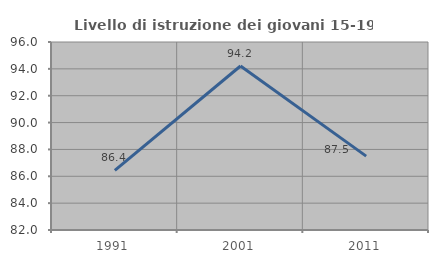
| Category | Livello di istruzione dei giovani 15-19 anni |
|---|---|
| 1991.0 | 86.441 |
| 2001.0 | 94.215 |
| 2011.0 | 87.5 |